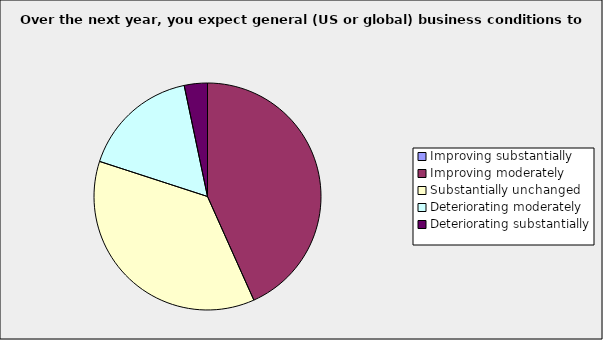
| Category | Series 0 |
|---|---|
| Improving substantially | 0 |
| Improving moderately | 0.433 |
| Substantially unchanged | 0.367 |
| Deteriorating moderately | 0.167 |
| Deteriorating substantially | 0.033 |